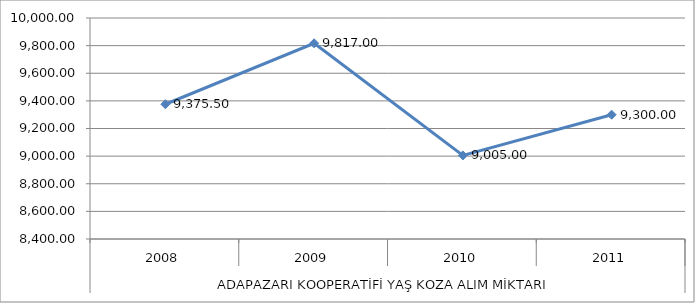
| Category | ADAPAZARI KOOP |
|---|---|
| 0 | 9375.5 |
| 1 | 9817 |
| 2 | 9005 |
| 3 | 9300 |